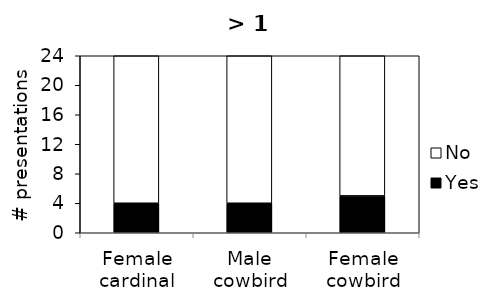
| Category | Yes | No |
|---|---|---|
| Female cardinal | 4 | 20 |
| Male cowbird | 4 | 20 |
| Female cowbird | 5 | 19 |